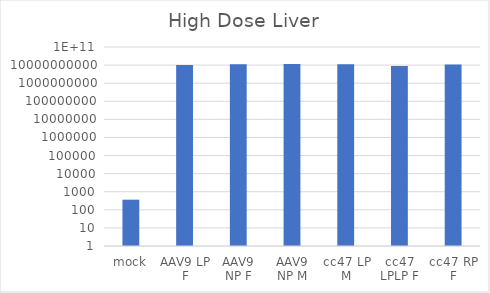
| Category | Series 0 |
|---|---|
| mock | 363.271 |
| AAV9 LP F | 10049656136.16 |
| AAV9 NP F | 11124526500.716 |
| AAV9 NP M | 11636409156.16 |
| cc47 LP M | 10991744282.049 |
| cc47 LPLP F | 8846051973.827 |
| cc47 RP F | 10624169146.604 |